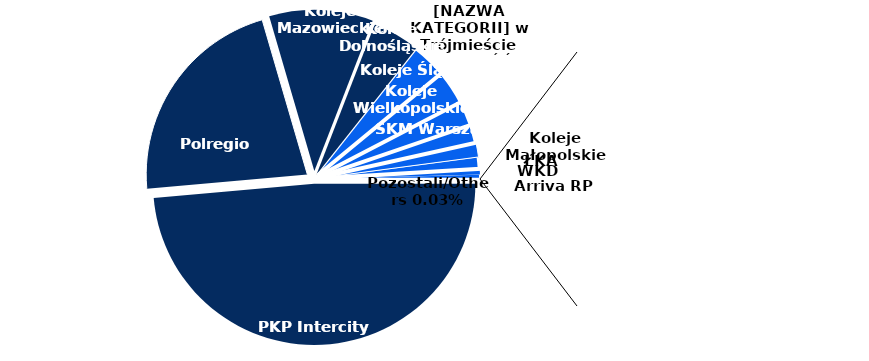
| Category | Series 0 |
|---|---|
| PKP Intercity | 0.486 |
| Polregio | 0.219 |
| Koleje Mazowieckie | 0.104 |
| PKP SKM | 0.048 |
| Koleje Dolnośląskie | 0.034 |
| Koleje Śląskie | 0.034 |
| Koleje Wielkopolskie | 0.024 |
| SKM Warszawa | 0.018 |
| Koleje Małopolskie | 0.014 |
| ŁKA | 0.011 |
| WKD | 0.006 |
| Arriva RP | 0.004 |
| Pozostali/Others | 0 |